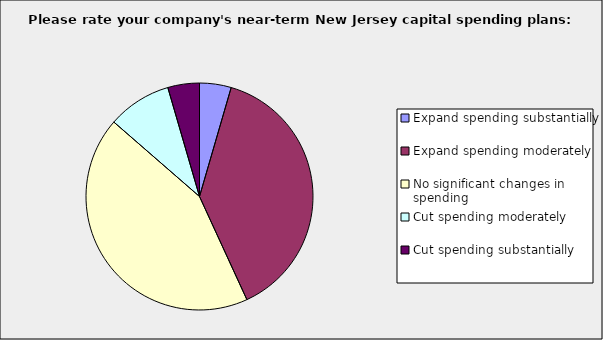
| Category | Series 0 |
|---|---|
| Expand spending substantially | 0.045 |
| Expand spending moderately | 0.386 |
| No significant changes in spending | 0.432 |
| Cut spending moderately | 0.091 |
| Cut spending substantially | 0.045 |